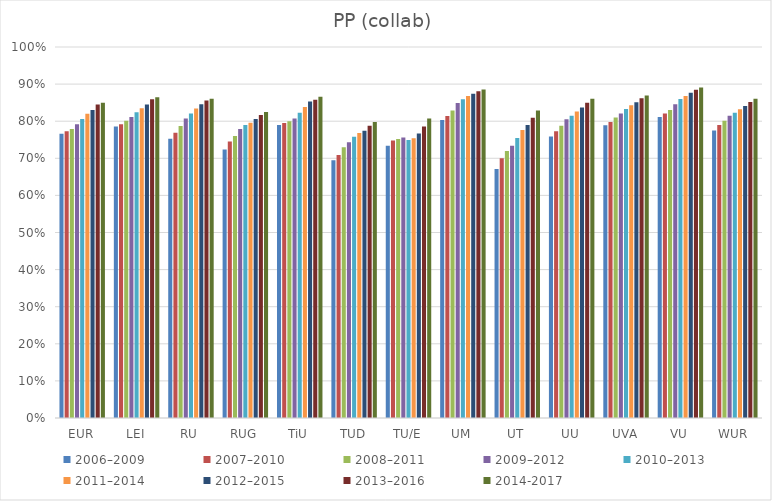
| Category | 2006–2009 | 2007–2010 | 2008–2011 | 2009–2012 | 2010–2013 | 2011–2014 | 2012–2015 | 2013–2016 | 2014-2017 |
|---|---|---|---|---|---|---|---|---|---|
| EUR | 76.6 | 77.3 | 77.9 | 79.2 | 80.6 | 82 | 83 | 84.5 | 84.952 |
| LEI | 78.6 | 79.2 | 80.1 | 81.1 | 82.4 | 83.5 | 84.5 | 85.9 | 86.442 |
| RU | 75.3 | 76.9 | 78.7 | 80.7 | 82.1 | 83.4 | 84.6 | 85.6 | 86.024 |
| RUG | 72.4 | 74.5 | 76 | 77.9 | 79 | 79.6 | 80.6 | 81.7 | 82.46 |
| TiU | 79 | 79.5 | 80 | 80.7 | 82.3 | 83.8 | 85.3 | 85.8 | 86.613 |
| TUD | 69.5 | 70.9 | 73 | 74.3 | 75.8 | 76.8 | 77.4 | 78.8 | 79.798 |
| TU/E | 73.4 | 74.8 | 75.2 | 75.6 | 74.9 | 75.4 | 76.7 | 78.6 | 80.755 |
| UM | 80.3 | 81.4 | 82.9 | 84.9 | 85.9 | 86.8 | 87.4 | 88.1 | 88.558 |
| UT | 67.1 | 70 | 72 | 73.4 | 75.5 | 77.6 | 79 | 80.9 | 82.907 |
| UU | 75.9 | 77.3 | 78.8 | 80.5 | 81.5 | 82.6 | 83.7 | 85 | 86.038 |
| UVA | 78.9 | 79.8 | 81 | 82.1 | 83.3 | 84.3 | 85.1 | 86.2 | 86.915 |
| VU | 81.1 | 82.1 | 83 | 84.6 | 86 | 86.8 | 87.7 | 88.5 | 89.059 |
| WUR | 77.5 | 79 | 80.1 | 81.5 | 82.3 | 83.2 | 84.1 | 85.2 | 86.018 |